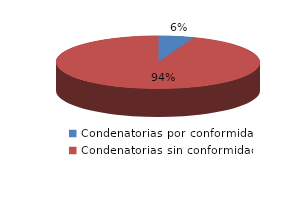
| Category | Series 0 |
|---|---|
| 0 | 6 |
| 1 | 99 |